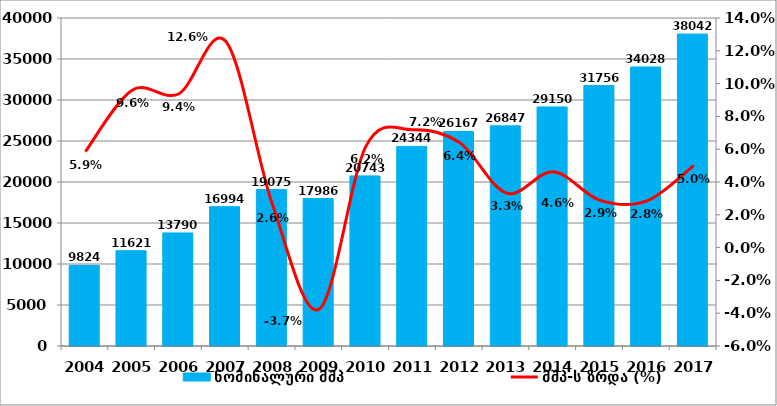
| Category | ნომინალური მშპ |
|---|---|
| 2004.0 | 9824.295 |
| 2005.0 | 11620.942 |
| 2006.0 | 13789.913 |
| 2007.0 | 16993.779 |
| 2008.0 | 19074.852 |
| 2009.0 | 17985.955 |
| 2010.0 | 20743.364 |
| 2011.0 | 24343.987 |
| 2012.0 | 26167.284 |
| 2013.0 | 26847.354 |
| 2014.0 | 29150.481 |
| 2015.0 | 31755.556 |
| 2016.0 | 34028.452 |
| 2017.0 | 38042.2 |